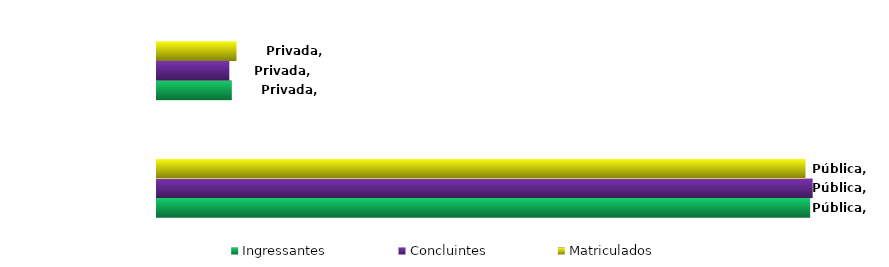
| Category | Ingressantes | Concluintes | Matriculados |
|---|---|---|---|
| Pública | 0.897 | 0.901 | 0.891 |
| Privada | 0.103 | 0.099 | 0.109 |